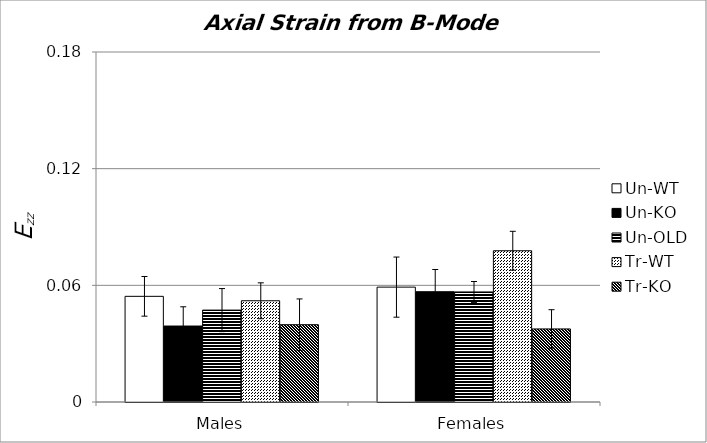
| Category | Un-WT | Un-KO | Un-OLD | Tr-WT | Tr-KO |
|---|---|---|---|---|---|
| 0 | 0.054 | 0.039 | 0.047 | 0.052 | 0.04 |
| 1 | 0.059 | 0.057 | 0.057 | 0.078 | 0.038 |